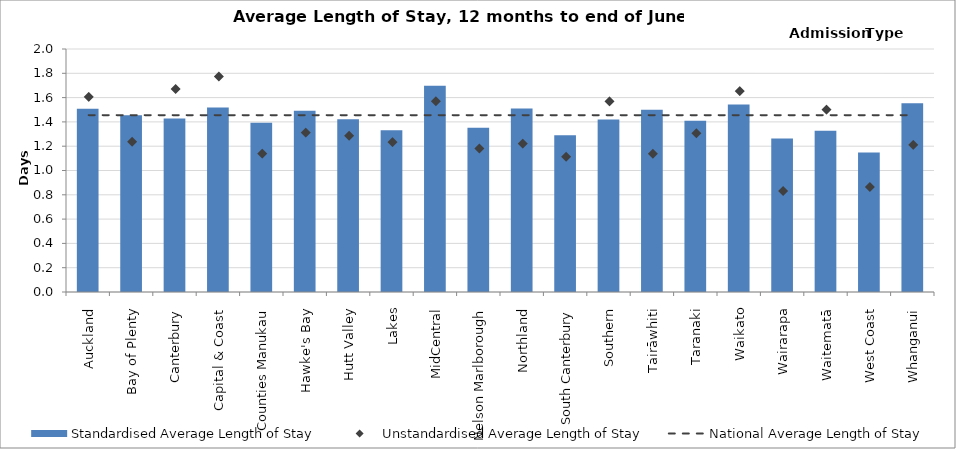
| Category | Standardised Average Length of Stay |
|---|---|
| Auckland | 1.508 |
| Bay of Plenty | 1.456 |
| Canterbury | 1.429 |
| Capital & Coast | 1.518 |
| Counties Manukau | 1.393 |
| Hawke's Bay | 1.491 |
| Hutt Valley | 1.421 |
| Lakes | 1.331 |
| MidCentral | 1.698 |
| Nelson Marlborough | 1.352 |
| Northland | 1.511 |
| South Canterbury | 1.291 |
| Southern | 1.421 |
| Tairāwhiti | 1.5 |
| Taranaki | 1.409 |
| Waikato | 1.543 |
| Wairarapa | 1.263 |
| Waitematā | 1.328 |
| West Coast | 1.148 |
| Whanganui | 1.554 |